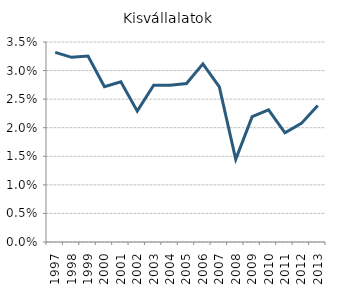
| Category | Series 0 |
|---|---|
| 1997.0 | 0.033 |
| 1998.0 | 0.032 |
| 1999.0 | 0.033 |
| 2000.0 | 0.027 |
| 2001.0 | 0.028 |
| 2002.0 | 0.023 |
| 2003.0 | 0.027 |
| 2004.0 | 0.027 |
| 2005.0 | 0.028 |
| 2006.0 | 0.031 |
| 2007.0 | 0.027 |
| 2008.0 | 0.014 |
| 2009.0 | 0.022 |
| 2010.0 | 0.023 |
| 2011.0 | 0.019 |
| 2012.0 | 0.021 |
| 2013.0 | 0.024 |